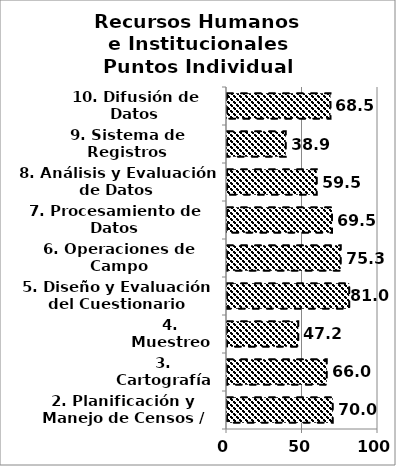
| Category | Series 0 |
|---|---|
| 2. Planificación y Manejo de Censos / Encuestas | 69.971 |
| 3. Cartografía | 66.049 |
| 4. Muestreo | 47.222 |
| 5. Diseño y Evaluación del Cuestionario | 80.952 |
| 6. Operaciones de Campo | 75.266 |
| 7. Procesamiento de Datos | 69.53 |
| 8. Análisis y Evaluación de Datos | 59.451 |
| 9. Sistema de Registros Administrativos | 38.889 |
| 10. Difusión de Datos | 68.519 |